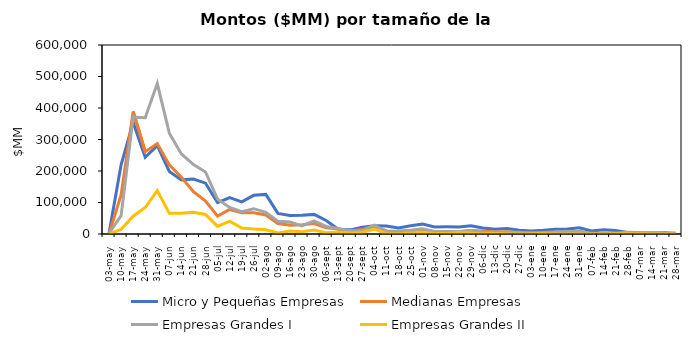
| Category | Micro y Pequeñas Empresas | Medianas Empresas | Empresas Grandes I | Empresas Grandes II |
|---|---|---|---|---|
| 03-may | 2641.899 | 391.008 | 2246 | 0 |
| 10-may | 219915.487 | 124210.819 | 58298.276 | 14547.002 |
| 17-may | 354127.785 | 388951.952 | 371015.218 | 56454.349 |
| 24-may | 243832.351 | 261283.385 | 369302.201 | 84078.958 |
| 31-may | 280222.31 | 287091.634 | 477490.563 | 137870.345 |
| 07-jun | 198724.14 | 219348.941 | 320095.324 | 65614.263 |
| 14-jun | 171882.971 | 180244.568 | 253967.497 | 65761.847 |
| 21-jun | 174529.524 | 134019 | 220308.068 | 69041.627 |
| 28-jun | 161283.43 | 104382.694 | 197025.144 | 62065.099 |
| 05-jul | 99441.817 | 56621.785 | 110162.704 | 24176.695 |
| 12-jul | 115722.522 | 77876.674 | 84442.635 | 40629.841 |
| 19-jul | 102187.925 | 67166.939 | 70793.753 | 19133.008 |
| 26-jul | 122804.003 | 67584.319 | 80351.662 | 15796.844 |
| 02-ago | 125633.805 | 60487.895 | 68723.697 | 13219.404 |
| 09-ago | 65419.992 | 33136.847 | 40363.766 | 3340.006 |
| 16-ago | 58704.431 | 28079.504 | 38050.047 | 9207.324 |
| 23-ago | 59780.208 | 29598.336 | 25888.41 | 6956.685 |
| 30-ago | 62251.409 | 33164.483 | 41932.603 | 12657.993 |
| 06-sept | 42883.399 | 19495.317 | 23901.868 | 3600.003 |
| 13-sept | 14825.782 | 15463.944 | 17784.971 | 6461.384 |
| 20-sept | 13162.727 | 9309.051 | 10637.466 | 3100 |
| 27-sept | 21238.154 | 13937.029 | 11227.887 | 5152.002 |
| 04-oct | 26030.073 | 23553.207 | 28305.317 | 15307.114 |
| 11-oct | 25215.897 | 9463.931 | 7887.28 | 1156.37 |
| 18-oct | 19483.985 | 7271.506 | 9432.396 | 1008.071 |
| 25-oct | 26144.383 | 9127.809 | 11562.485 | 3308.066 |
| 01-nov | 31325.086 | 13097.23 | 16671.084 | 5751.313 |
| 08-nov | 22355.004 | 7989.014 | 7401.072 | 1854.034 |
| 15-nov | 22731.9 | 6407.165 | 8129.036 | 1500 |
| 22-nov | 22327.365 | 7101.681 | 6881.364 | 4545 |
| 29-nov | 25796.157 | 11170.764 | 11298.544 | 3437 |
| 06-dic | 19356.484 | 9926.944 | 6051.305 | 403.23 |
| 13-dic | 14832.336 | 5899.179 | 2527.53 | 2000 |
| 20-dic | 17262.483 | 7402.476 | 5426.174 | 0 |
| 27-dic | 11889.203 | 4207.584 | 5787.848 | 0 |
| 03-ene | 9656.698 | 4402.589 | 1941.912 | 800 |
| 10-ene | 11932.026 | 3984.256 | 4890.775 | 1300 |
| 17-ene | 15116.648 | 4829.145 | 6666.85 | 0 |
| 24-ene | 16145.929 | 5421.173 | 6615.591 | 0 |
| 31-ene | 20063.544 | 6776.614 | 8322.761 | 0 |
| 07-feb | 9477.149 | 2799.706 | 1001.617 | 0 |
| 14-feb | 13823.173 | 1556.374 | 2181.614 | 0 |
| 21-feb | 10909.215 | 2731.436 | 2304.666 | 1000 |
| 28-feb | 4861.449 | 2222.804 | 5500.004 | 400 |
| 07-mar | 2768.465 | 1672.99 | 4800 | 700 |
| 14-mar | 3029.032 | 1509.274 | 5117.202 | 0 |
| 21-mar | 3573.063 | 941.093 | 2030 | 0 |
| 28-mar | 2562.287 | 1580.089 | 1604.5 | 0 |